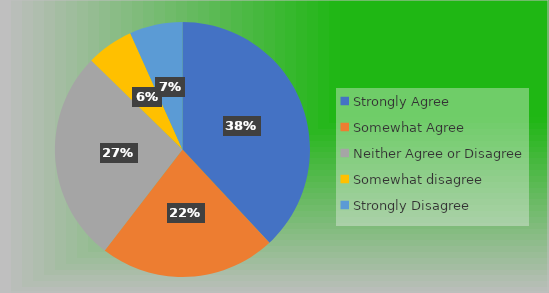
| Category | Series 0 |
|---|---|
| Strongly Agree | 51 |
| Somewhat Agree | 30 |
| Neither Agree or Disagree | 36 |
| Somewhat disagree | 8 |
| Strongly Disagree | 9 |